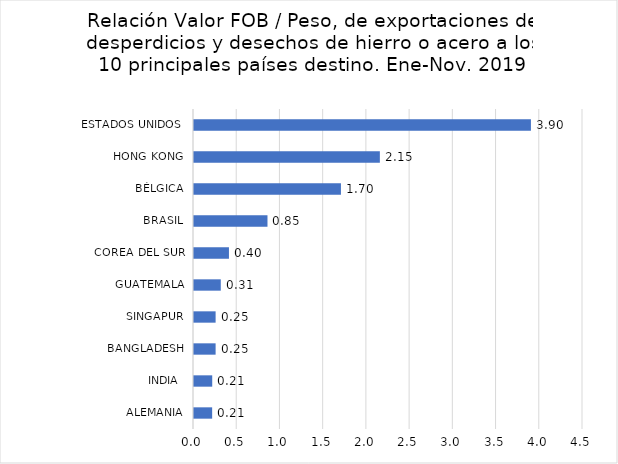
| Category | Series 0 |
|---|---|
| ALEMANIA | 0.21 |
| INDIA  | 0.211 |
| BANGLADESH | 0.25 |
| SINGAPUR | 0.25 |
| GUATEMALA | 0.31 |
| COREA DEL SUR | 0.404 |
| BRASIL | 0.85 |
| BÉLGICA | 1.7 |
| HONG KONG | 2.15 |
| ESTADOS UNIDOS  | 3.898 |